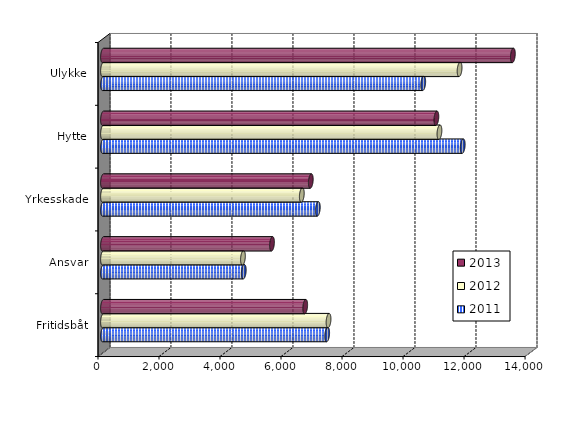
| Category | 2011 | 2012 | 2013 |
|---|---|---|---|
| Fritidsbåt | 7349 | 7393.622 | 6629 |
| Ansvar | 4615 | 4587.775 | 5540.282 |
| Yrkesskade | 7042 | 6517.332 | 6811.781 |
| Hytte | 11793 | 11029.274 | 10929 |
| Ulykke | 10498 | 11689.759 | 13436.618 |